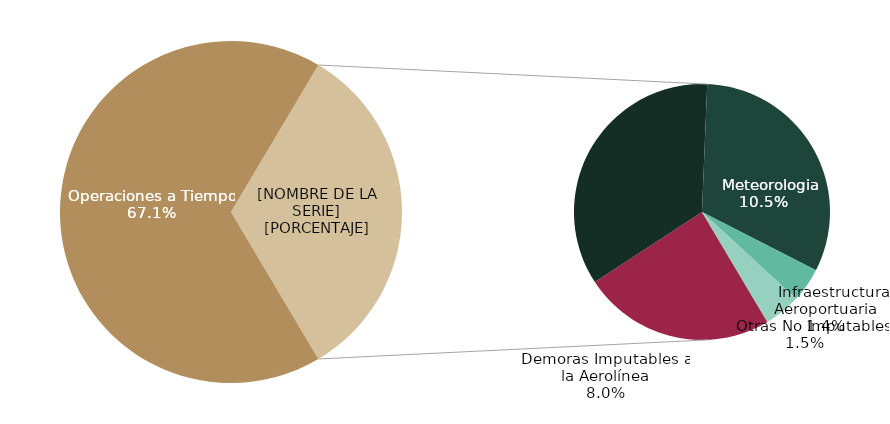
| Category | Demoras |
|---|---|
| Operaciones a Tiempo | 194931 |
| Demoras Imputables a la Aerolínea | 23267 |
|    Aplicación De Control De Flujo | 33366 |
|    Meteorologia | 30489 |
|    Infraestructura Aeroportuaria | 4151 |
|    Otras No Imputables | 4400 |